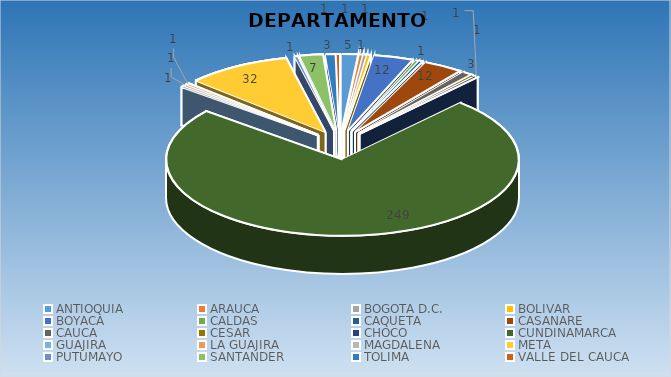
| Category | CANTIDAD |
|---|---|
| ANTIOQUIA | 5 |
| ARAUCA | 1 |
| BOGOTA D.C. | 1 |
| BOLIVAR | 1 |
| BOYACA | 12 |
| CALDAS | 1 |
| CAQUETA | 1 |
| CASANARE | 12 |
| CAUCA | 3 |
| CESAR | 1 |
| CHOCO | 1 |
| CUNDINAMARCA | 249 |
| GUAJIRA | 1 |
| LA GUAJIRA | 1 |
| MAGDALENA | 1 |
| META | 32 |
| PUTUMAYO | 1 |
| SANTANDER | 7 |
| TOLIMA | 3 |
| VALLE DEL CAUCA | 1 |